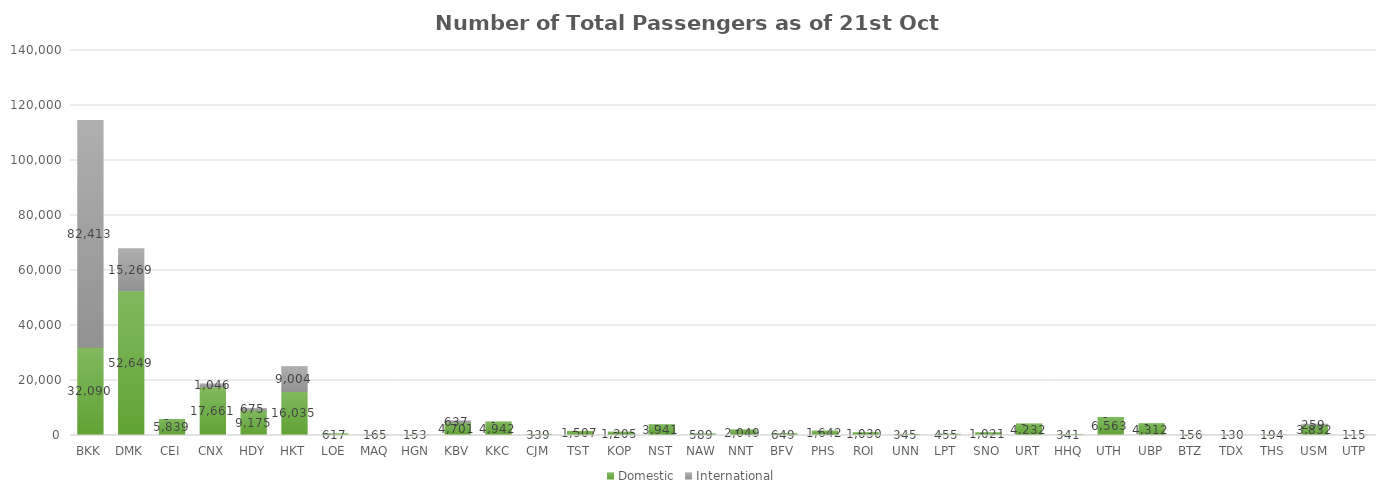
| Category | Domestic | International |
|---|---|---|
| BKK | 32090 | 82413 |
| DMK | 52649 | 15269 |
| CEI | 5839 | 0 |
| CNX | 17661 | 1046 |
| HDY | 9175 | 675 |
| HKT | 16035 | 9004 |
| LOE | 617 | 0 |
| MAQ | 165 | 0 |
| HGN | 153 | 0 |
| KBV | 4701 | 637 |
| KKC | 4942 | 0 |
| CJM | 339 | 0 |
| TST | 1507 | 0 |
| KOP | 1205 | 0 |
| NST | 3941 | 0 |
| NAW | 589 | 0 |
| NNT | 2049 | 0 |
| BFV | 649 | 0 |
| PHS | 1642 | 0 |
| ROI | 1030 | 0 |
| UNN | 345 | 0 |
| LPT | 455 | 0 |
| SNO | 1021 | 0 |
| URT | 4232 | 0 |
| HHQ | 341 | 0 |
| UTH | 6563 | 0 |
| UBP | 4312 | 0 |
| BTZ | 156 | 0 |
| TDX | 130 | 0 |
| THS | 194 | 0 |
| USM | 3832 | 259 |
| UTP | 115 | 0 |